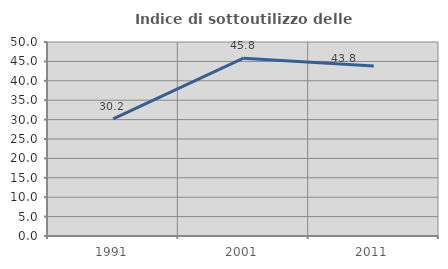
| Category | Indice di sottoutilizzo delle abitazioni  |
|---|---|
| 1991.0 | 30.205 |
| 2001.0 | 45.828 |
| 2011.0 | 43.823 |